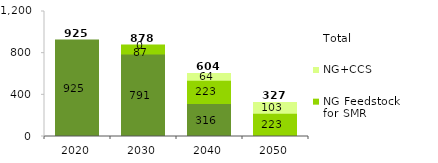
| Category | NG | NG Feedstock for SMR | NG+CCS | Total |
|---|---|---|---|---|
| 2020.0 | 925.386 | 0 | 0 | 925.386 |
| 2030.0 | 791.115 | 86.565 | 0 | 877.681 |
| 2040.0 | 316.277 | 223.308 | 64.44 | 604.025 |
| 2050.0 | 0 | 223.308 | 103.493 | 326.801 |